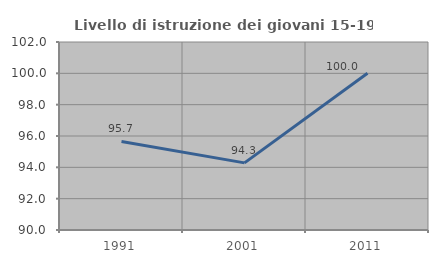
| Category | Livello di istruzione dei giovani 15-19 anni |
|---|---|
| 1991.0 | 95.652 |
| 2001.0 | 94.286 |
| 2011.0 | 100 |